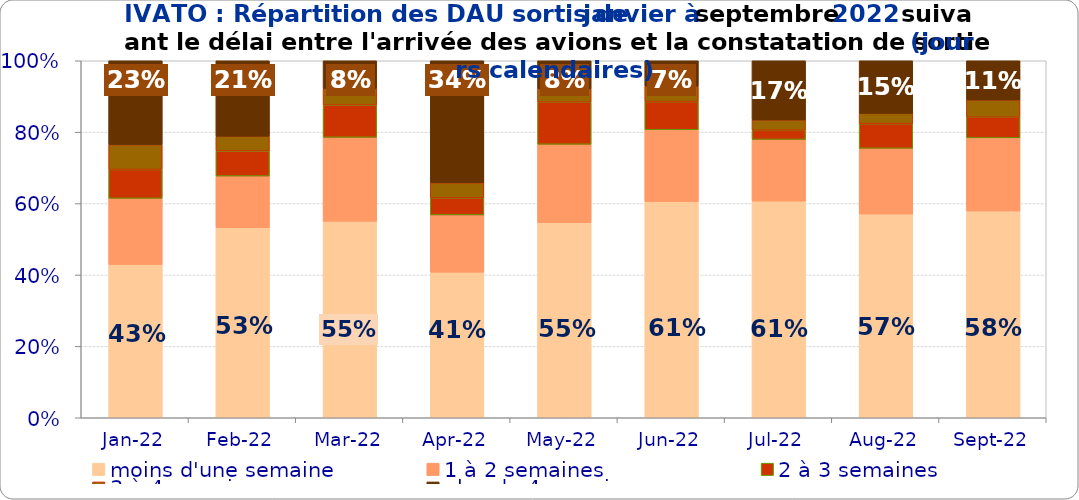
| Category | moins d'une semaine | 1 à 2 semaines | 2 à 3 semaines | 3 à 4 semaines | plus de 4 semaines |
|---|---|---|---|---|---|
| 2022-01-01 | 0.429 | 0.185 | 0.081 | 0.07 | 0.235 |
| 2022-02-01 | 0.532 | 0.145 | 0.07 | 0.041 | 0.211 |
| 2022-03-01 | 0.55 | 0.235 | 0.09 | 0.047 | 0.078 |
| 2022-04-01 | 0.408 | 0.16 | 0.048 | 0.042 | 0.342 |
| 2022-05-01 | 0.547 | 0.219 | 0.118 | 0.037 | 0.079 |
| 2022-06-01 | 0.606 | 0.201 | 0.079 | 0.043 | 0.071 |
| 2022-07-01 | 0.607 | 0.173 | 0.026 | 0.029 | 0.166 |
| 2022-08-01 | 0.571 | 0.184 | 0.069 | 0.029 | 0.147 |
| 2022-09-01 | 0.579 | 0.205 | 0.058 | 0.048 | 0.11 |